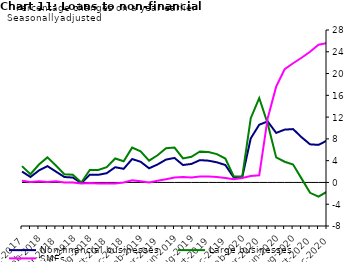
| Category | zero | Non-financial businesses | Large businesses | SMEs |
|---|---|---|---|---|
| Dec-2017 | 0 | 2 | 3 | 0.3 |
| Jan-2018 | 0 | 1 | 1.5 | 0.1 |
| Feb-2018 | 0 | 2.2 | 3.3 | 0.2 |
| Mar-2018 | 0 | 3 | 4.6 | 0.1 |
| Apr-2018 | 0 | 2 | 3.1 | 0.2 |
| May-2018 | 0 | 1 | 1.5 | 0 |
| Jun-2018 | 0 | 0.9 | 1.4 | 0 |
| Jul-2018 | 0 | -0.1 | 0 | -0.2 |
| Aug-2018 | 0 | 1.4 | 2.3 | -0.1 |
| Sep-2018 | 0 | 1.4 | 2.3 | -0.2 |
| Oct-2018 | 0 | 1.7 | 2.8 | -0.2 |
| Nov-2018 | 0 | 2.8 | 4.4 | -0.2 |
| Dec-2018 | 0 | 2.5 | 3.9 | 0 |
| Jan-2019 | 0 | 4.3 | 6.4 | 0.4 |
| Feb-2019 | 0 | 3.8 | 5.7 | 0.2 |
| Mar-2019 | 0 | 2.6 | 4 | 0 |
| Apr-2019 | 0 | 3.3 | 5 | 0.3 |
| May-2019 | 0 | 4.2 | 6.3 | 0.6 |
| Jun-2019 | 0 | 4.5 | 6.4 | 0.9 |
| Jul-2019 | 0 | 3.2 | 4.4 | 1 |
| Aug-2019 | 0 | 3.4 | 4.7 | 0.9 |
| Sep-2019 | 0 | 4.1 | 5.7 | 1.1 |
| Oct-2019 | 0 | 4 | 5.6 | 1.1 |
| Nov-2019 | 0 | 3.7 | 5.2 | 1 |
| Dec-2019 | 0 | 3.2 | 4.4 | 0.8 |
| Jan-2020 | 0 | 0.9 | 1.1 | 0.6 |
| Feb-2020 | 0 | 1 | 1.1 | 0.8 |
| Mar-2020 | 0 | 8.1 | 11.8 | 1.2 |
| Apr-2020 | 0 | 10.6 | 15.5 | 1.3 |
| May-2020 | 0 | 11.2 | 10.8 | 11.8 |
| Jun-2020 | 0 | 9.1 | 4.6 | 17.6 |
| Jul-2020 | 0 | 9.7 | 3.8 | 20.8 |
| Aug-2020 | 0 | 9.8 | 3.3 | 21.9 |
| Sep-2020 | 0 | 8.3 | 0.7 | 22.9 |
| Oct-2020 | 0 | 7 | -1.9 | 24 |
| Nov-2020 | 0 | 6.9 | -2.6 | 25.3 |
| Dec-2020 | 0 | 7.7 | -1.7 | 25.6 |